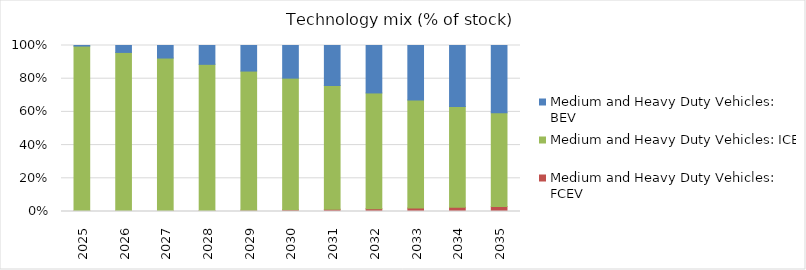
| Category | Medium and Heavy Duty Vehicles: FCEV | Medium and Heavy Duty Vehicles: ICE | Medium and Heavy Duty Vehicles: BEV |
|---|---|---|---|
| 2025.0 | 0.004 | 0.992 | 0.003 |
| 2026.0 | 0.004 | 0.954 | 0.042 |
| 2027.0 | 0.005 | 0.92 | 0.076 |
| 2028.0 | 0.006 | 0.88 | 0.113 |
| 2029.0 | 0.008 | 0.838 | 0.154 |
| 2030.0 | 0.011 | 0.793 | 0.197 |
| 2031.0 | 0.014 | 0.746 | 0.241 |
| 2032.0 | 0.017 | 0.697 | 0.286 |
| 2033.0 | 0.021 | 0.651 | 0.328 |
| 2034.0 | 0.025 | 0.607 | 0.368 |
| 2035.0 | 0.03 | 0.566 | 0.404 |